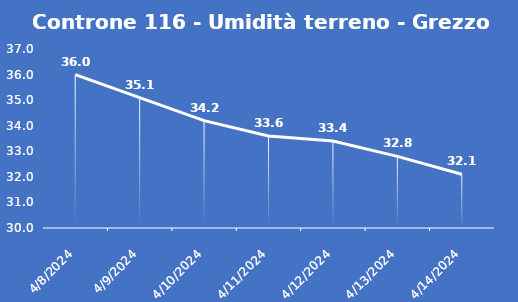
| Category | Controne 116 - Umidità terreno - Grezzo (%VWC) |
|---|---|
| 4/8/24 | 36 |
| 4/9/24 | 35.1 |
| 4/10/24 | 34.2 |
| 4/11/24 | 33.6 |
| 4/12/24 | 33.4 |
| 4/13/24 | 32.8 |
| 4/14/24 | 32.1 |